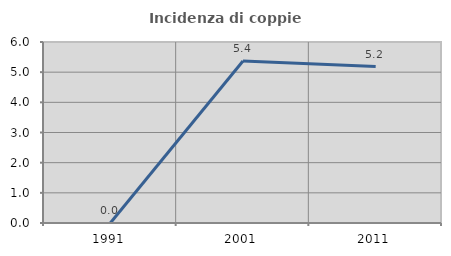
| Category | Incidenza di coppie miste |
|---|---|
| 1991.0 | 0 |
| 2001.0 | 5.369 |
| 2011.0 | 5.185 |